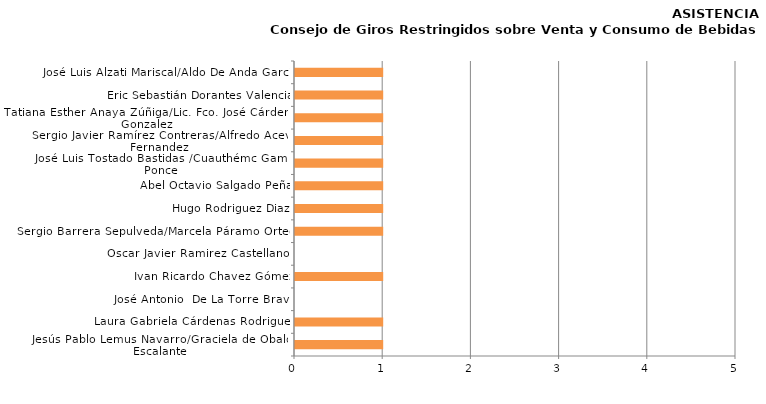
| Category | Series 0 |
|---|---|
| Jesús Pablo Lemus Navarro/Graciela de Obaldía Escalante | 1 |
| Laura Gabriela Cárdenas Rodriguez | 1 |
| José Antonio  De La Torre Bravo | 0 |
| Ivan Ricardo Chavez Gómez | 1 |
| Oscar Javier Ramirez Castellanos | 0 |
| Sergio Barrera Sepulveda/Marcela Páramo Ortega | 1 |
| Hugo Rodriguez Diaz | 1 |
| Abel Octavio Salgado Peña | 1 |
| José Luis Tostado Bastidas /Cuauthémc Gamez Ponce | 1 |
| Sergio Javier Ramírez Contreras/Alfredo Aceves Fernandez | 1 |
| Tatiana Esther Anaya Zúñiga/Lic. Fco. José Cárdenas Gonzalez | 1 |
| Eric Sebastián Dorantes Valencia | 1 |
| José Luis Alzati Mariscal/Aldo De Anda García | 1 |